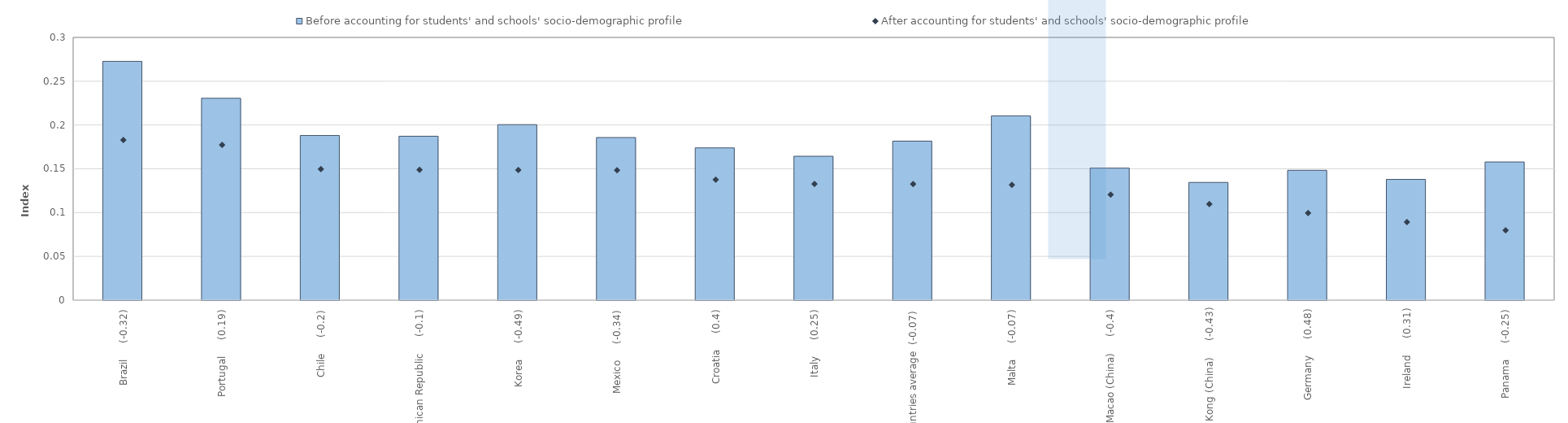
| Category | Before accounting for students' and schools' socio-demographic profile |
|---|---|
| Brazil     (-0.32) | 0.273 |
| Portugal     (0.19) | 0.231 |
| Chile     (-0.2) | 0.188 |
| Dominican Republic     (-0.1) | 0.187 |
| Korea     (-0.49) | 0.2 |
| Mexico     (-0.34) | 0.186 |
| Croatia     (0.4) | 0.174 |
| Italy     (0.25) | 0.164 |
| All countries average  (-0.07) | 0.182 |
| Malta     (-0.07) | 0.21 |
| Macao (China)     (-0.4) | 0.151 |
| Hong Kong (China)     (-0.43) | 0.134 |
| Germany     (0.48) | 0.148 |
| Ireland     (0.31) | 0.138 |
| Panama     (-0.25) | 0.158 |